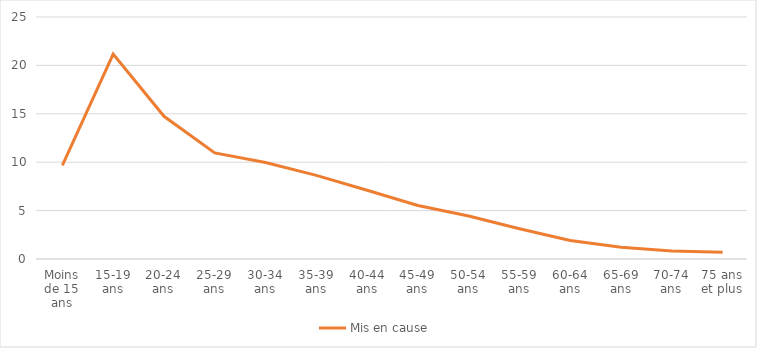
| Category | Mis en cause |
|---|---|
| Moins de 15 ans | 9.66 |
| 15-19 ans | 21.16 |
| 20-24 ans | 14.74 |
| 25-29 ans | 10.96 |
| 30-34 ans | 9.97 |
| 35-39 ans | 8.64 |
| 40-44 ans | 7.1 |
| 45-49 ans | 5.53 |
| 50-54 ans | 4.44 |
| 55-59 ans | 3.13 |
| 60-64 ans | 1.92 |
| 65-69 ans | 1.21 |
| 70-74 ans | 0.82 |
| 75 ans et plus | 0.71 |